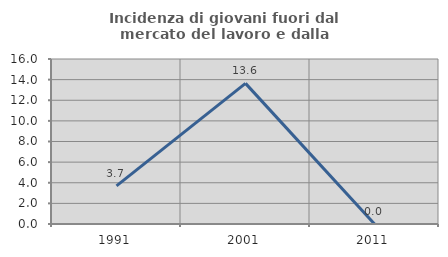
| Category | Incidenza di giovani fuori dal mercato del lavoro e dalla formazione  |
|---|---|
| 1991.0 | 3.704 |
| 2001.0 | 13.636 |
| 2011.0 | 0 |